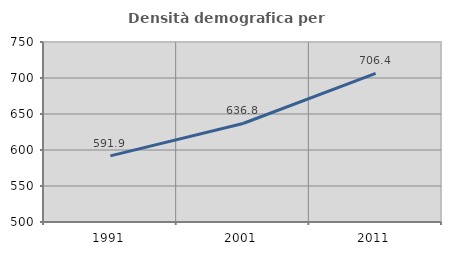
| Category | Densità demografica |
|---|---|
| 1991.0 | 591.89 |
| 2001.0 | 636.839 |
| 2011.0 | 706.403 |